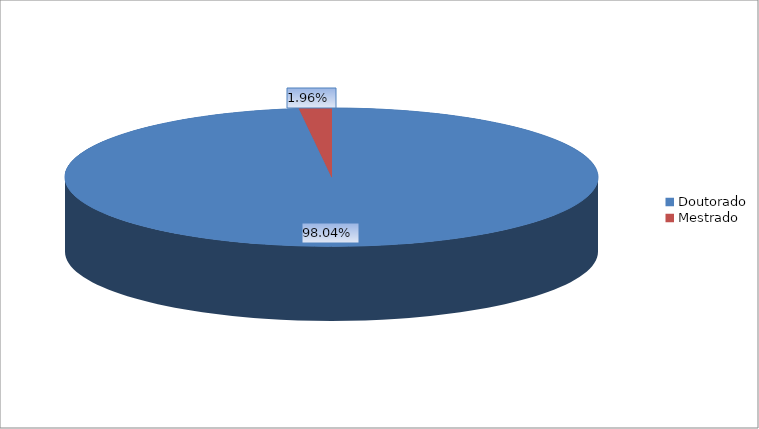
| Category | Total de produções |
|---|---|
| Doutorado | 799 |
| Mestrado | 16 |